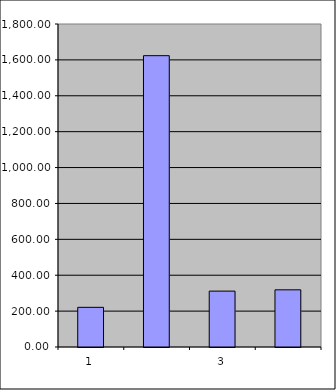
| Category | Series 0 |
|---|---|
| 0 | 221 |
| 1 | 1623.433 |
| 2 | 311.416 |
| 3 | 318.567 |